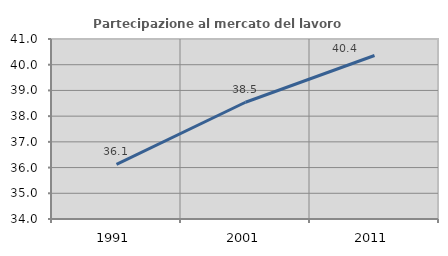
| Category | Partecipazione al mercato del lavoro  femminile |
|---|---|
| 1991.0 | 36.124 |
| 2001.0 | 38.54 |
| 2011.0 | 40.359 |